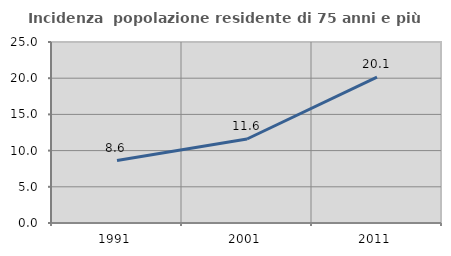
| Category | Incidenza  popolazione residente di 75 anni e più |
|---|---|
| 1991.0 | 8.629 |
| 2001.0 | 11.604 |
| 2011.0 | 20.148 |